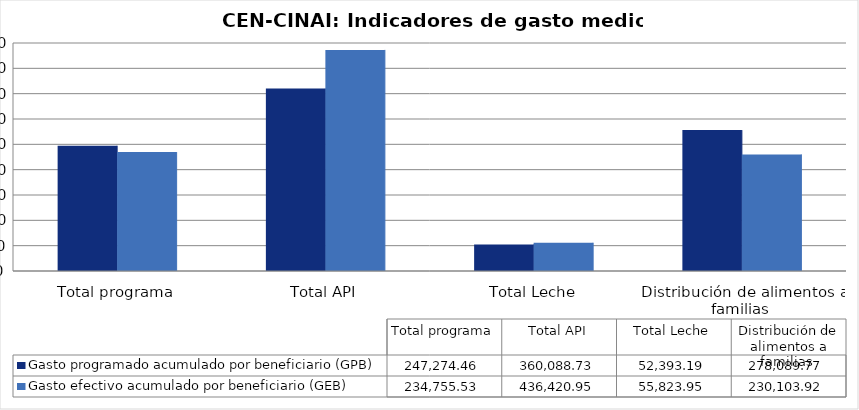
| Category | Gasto programado acumulado por beneficiario (GPB)  | Gasto efectivo acumulado por beneficiario (GEB)  |
|---|---|---|
| Total programa | 247274.457 | 234755.535 |
| Total API | 360088.729 | 436420.951 |
| Total Leche | 52393.189 | 55823.955 |
| Distribución de alimentos a familias  | 278089.771 | 230103.925 |